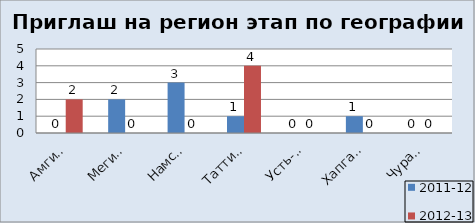
| Category | 2011-12 | 2012-13 |
|---|---|---|
| Амгинский | 0 | 2 |
| Мегино-Кангаласс | 2 | 0 |
| Намский | 3 | 0 |
| Таттинский | 1 | 4 |
| Усть-Алданский | 0 | 0 |
| Хапгаласский | 1 | 0 |
| Чурапчинский | 0 | 0 |